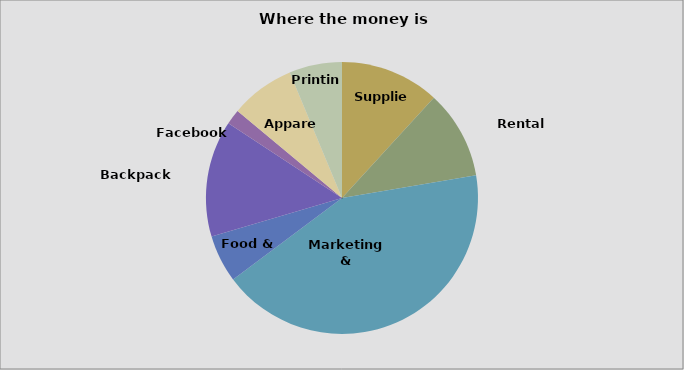
| Category | Amount |
|---|---|
| Supplies | 554.5 |
| Rental Supplies | 495 |
| Marketing & Advertising | 1995 |
| Food & Beverages | 265 |
| Backpack Program | 650 |
| Facebook Promo | 85 |
| Apparel | 360 |
| Printing | 295 |